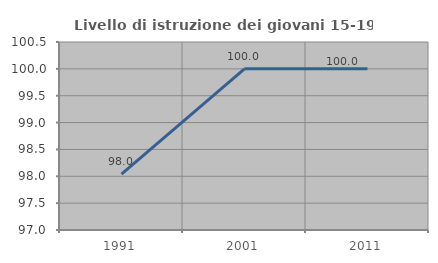
| Category | Livello di istruzione dei giovani 15-19 anni |
|---|---|
| 1991.0 | 98.039 |
| 2001.0 | 100 |
| 2011.0 | 100 |